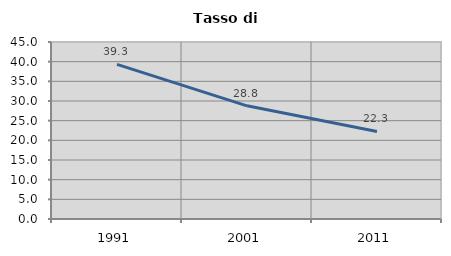
| Category | Tasso di disoccupazione   |
|---|---|
| 1991.0 | 39.3 |
| 2001.0 | 28.772 |
| 2011.0 | 22.25 |